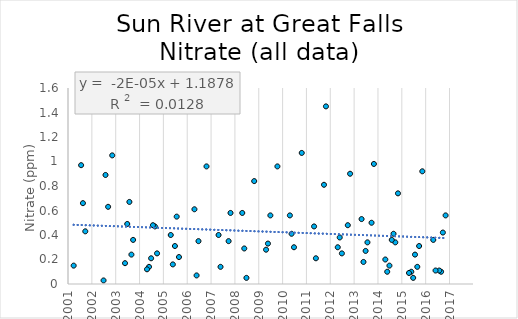
| Category | Series 0 |
|---|---|
| 42638.0 | 0.42 |
| 42611.0 | 0.1 |
| 42582.0 | 0.11 |
| 42274.0 | 0.31 |
| 42246.0 | 0.14 |
| 42211.0 | 0.24 |
| 41909.0 | 0.34 |
| 41882.0 | 0.41 |
| 41855.0 | 0.36 |
| 41545.0 | 0.5 |
| 41482.0 | 0.34 |
| 41181.0 | 0.48 |
| 40816.0 | 0.81 |
| 39354.0 | 0.35 |
| 38593.0 | 0.22 |
| 38558.0 | 0.55 |
| 38257.0 | 0.25 |
| 38224.0 | 0.47 |
| 38194.0 | 0.48 |
| 37890.0 | 0.36 |
| 37864.0 | 0.24 |
| 37833.0 | 0.67 |
| 37507.0 | 0.63 |
| 37467.0 | 0.89 |
| 37157.0 | 0.43 |
| 37121.0 | 0.66 |
| 37093.0 | 0.97 |
| 42680.0 | 0.56 |
| 42526.0 | 0.11 |
| 42491.0 | 0.36 |
| 42323.0 | 0.92 |
| 42183.0 | 0.05 |
| 42154.0 | 0.1 |
| 42119.0 | 0.09 |
| 41950.0 | 0.74 |
| 41819.0 | 0.15 |
| 41785.0 | 0.1 |
| 41756.0 | 0.2 |
| 41581.0 | 0.98 |
| 41454.0 | 0.27 |
| 41421.0 | 0.18 |
| 41392.0 | 0.53 |
| 41216.0 | 0.9 |
| 41090.0 | 0.25 |
| 41057.0 | 0.38 |
| 41027.0 | 0.3 |
| 40846.0 | 1.45 |
| 40692.0 | 0.21 |
| 40664.0 | 0.47 |
| 40475.0 | 1.07 |
| 40356.0 | 0.3 |
| 40319.0 | 0.41 |
| 40293.0 | 0.56 |
| 40102.0 | 0.96 |
| 39994.0 | 0.56 |
| 39957.0 | 0.33 |
| 39928.0 | 0.28 |
| 39746.0 | 0.84 |
| 39627.0 | 0.05 |
| 39594.0 | 0.29 |
| 39563.0 | 0.58 |
| 39383.0 | 0.58 |
| 39230.0 | 0.14 |
| 39200.0 | 0.4 |
| 39015.0 | 0.96 |
| 38892.0 | 0.35 |
| 38863.0 | 0.07 |
| 38830.0 | 0.61 |
| 38531.0 | 0.31 |
| 38499.0 | 0.16 |
| 38467.0 | 0.4 |
| 38166.0 | 0.21 |
| 38134.0 | 0.14 |
| 38103.0 | 0.12 |
| 37800.0 | 0.49 |
| 37766.0 | 0.17 |
| 37570.0 | 1.05 |
| 37437.0 | 0.029 |
| 36979.0 | 0.15 |